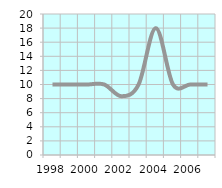
| Category | Average Employees
 per establishment |
|---|---|
| 1998.0 | 10 |
| 1999.0 | 10 |
| 2000.0 | 10 |
| 2001.0 | 10 |
| 2002.0 | 8.333 |
| 2003.0 | 10 |
| 2004.0 | 18 |
| 2005.0 | 10 |
| 2006.0 | 10 |
| 2007.0 | 10 |